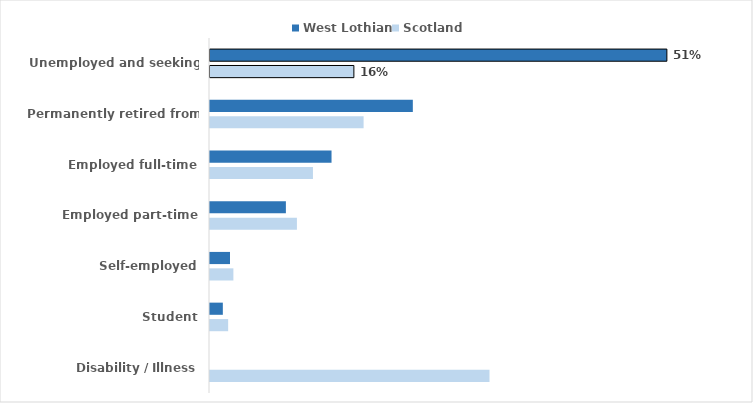
| Category | West Lothian | Scotland |
|---|---|---|
| Unemployed and seeking work | 0.513 | 0.162 |
| Permanently retired from work | 0.228 | 0.173 |
| Employed full-time | 0.137 | 0.116 |
| Employed part-time | 0.085 | 0.098 |
| Self-employed | 0.023 | 0.026 |
| Student | 0.014 | 0.02 |
| Disability / Illness | 0 | 0.314 |